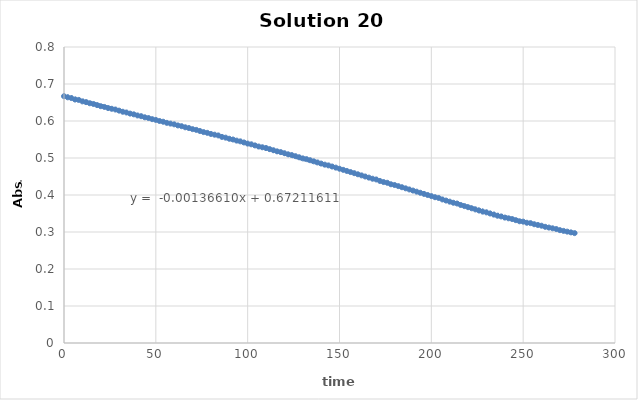
| Category | Series 0 |
|---|---|
| 0.0 | 0.667 |
| 2.0 | 0.664 |
| 4.0 | 0.662 |
| 6.0 | 0.658 |
| 8.0 | 0.657 |
| 10.0 | 0.653 |
| 12.0 | 0.651 |
| 14.0 | 0.648 |
| 16.0 | 0.646 |
| 18.0 | 0.643 |
| 20.0 | 0.64 |
| 22.0 | 0.638 |
| 24.0 | 0.635 |
| 26.0 | 0.633 |
| 28.0 | 0.631 |
| 30.0 | 0.628 |
| 32.0 | 0.625 |
| 34.0 | 0.623 |
| 36.0 | 0.62 |
| 38.0 | 0.618 |
| 40.0 | 0.615 |
| 42.0 | 0.613 |
| 44.0 | 0.61 |
| 46.0 | 0.608 |
| 48.0 | 0.605 |
| 50.0 | 0.603 |
| 52.0 | 0.6 |
| 54.0 | 0.598 |
| 56.0 | 0.595 |
| 58.0 | 0.593 |
| 60.0 | 0.591 |
| 62.0 | 0.588 |
| 64.0 | 0.586 |
| 66.0 | 0.583 |
| 68.0 | 0.581 |
| 70.0 | 0.578 |
| 72.0 | 0.576 |
| 74.0 | 0.573 |
| 76.0 | 0.57 |
| 78.0 | 0.568 |
| 80.0 | 0.565 |
| 82.0 | 0.563 |
| 84.0 | 0.561 |
| 86.0 | 0.557 |
| 88.0 | 0.555 |
| 90.0 | 0.552 |
| 92.0 | 0.55 |
| 94.0 | 0.547 |
| 96.0 | 0.545 |
| 98.0 | 0.542 |
| 100.0 | 0.539 |
| 102.0 | 0.537 |
| 104.0 | 0.534 |
| 106.0 | 0.531 |
| 108.0 | 0.529 |
| 110.0 | 0.527 |
| 112.0 | 0.524 |
| 114.0 | 0.521 |
| 116.0 | 0.518 |
| 118.0 | 0.516 |
| 120.0 | 0.513 |
| 122.0 | 0.51 |
| 124.0 | 0.508 |
| 126.0 | 0.505 |
| 128.0 | 0.502 |
| 130.0 | 0.499 |
| 132.0 | 0.497 |
| 134.0 | 0.494 |
| 136.0 | 0.491 |
| 138.0 | 0.488 |
| 140.0 | 0.485 |
| 142.0 | 0.482 |
| 144.0 | 0.48 |
| 146.0 | 0.477 |
| 148.0 | 0.474 |
| 150.0 | 0.471 |
| 152.0 | 0.468 |
| 154.0 | 0.465 |
| 156.0 | 0.462 |
| 158.0 | 0.459 |
| 160.0 | 0.456 |
| 162.0 | 0.453 |
| 164.0 | 0.45 |
| 166.0 | 0.447 |
| 168.0 | 0.444 |
| 170.0 | 0.442 |
| 172.0 | 0.438 |
| 174.0 | 0.435 |
| 176.0 | 0.433 |
| 178.0 | 0.429 |
| 180.0 | 0.427 |
| 182.0 | 0.424 |
| 184.0 | 0.421 |
| 186.0 | 0.418 |
| 188.0 | 0.415 |
| 190.0 | 0.412 |
| 192.0 | 0.409 |
| 194.0 | 0.406 |
| 196.0 | 0.403 |
| 198.0 | 0.4 |
| 200.0 | 0.397 |
| 202.0 | 0.394 |
| 204.0 | 0.392 |
| 206.0 | 0.388 |
| 208.0 | 0.385 |
| 210.0 | 0.382 |
| 212.0 | 0.379 |
| 214.0 | 0.377 |
| 216.0 | 0.373 |
| 218.0 | 0.37 |
| 220.0 | 0.367 |
| 222.0 | 0.364 |
| 224.0 | 0.361 |
| 226.0 | 0.358 |
| 228.0 | 0.355 |
| 230.0 | 0.353 |
| 232.0 | 0.35 |
| 234.0 | 0.347 |
| 236.0 | 0.344 |
| 238.0 | 0.342 |
| 240.0 | 0.339 |
| 242.0 | 0.337 |
| 244.0 | 0.335 |
| 246.0 | 0.332 |
| 248.0 | 0.329 |
| 250.0 | 0.328 |
| 252.0 | 0.325 |
| 254.0 | 0.324 |
| 256.0 | 0.321 |
| 258.0 | 0.319 |
| 260.0 | 0.317 |
| 262.0 | 0.314 |
| 264.0 | 0.312 |
| 266.0 | 0.31 |
| 268.0 | 0.308 |
| 270.0 | 0.305 |
| 272.0 | 0.303 |
| 274.0 | 0.301 |
| 276.0 | 0.299 |
| 278.0 | 0.297 |